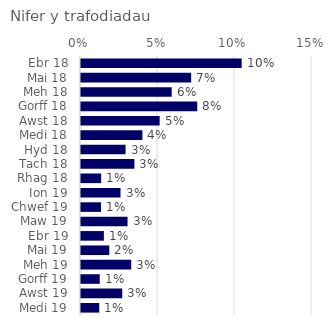
| Category | Nifer y trafodiadau |
|---|---|
| Ebr 18 | 0.104 |
| Mai 18 | 0.072 |
| Meh 18 | 0.059 |
| Gorff 18 | 0.075 |
| Awst 18 | 0.051 |
| Medi 18 | 0.04 |
| Hyd 18 | 0.029 |
| Tach 18 | 0.035 |
| Rhag 18 | 0.013 |
| Ion 19 | 0.026 |
| Chwef 19 | 0.013 |
| Maw 19 | 0.03 |
| Ebr 19 | 0.015 |
| Mai 19 | 0.018 |
| Meh 19 | 0.033 |
| Gorff 19 | 0.012 |
| Awst 19 | 0.027 |
| Medi 19 | 0.012 |